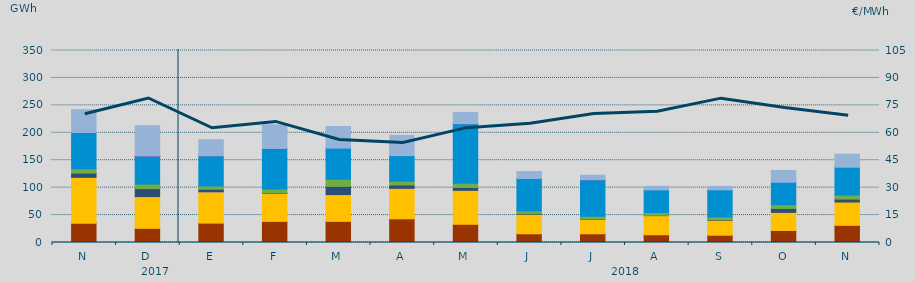
| Category | Carbón | Ciclo Combinado | Cogeneración | Consumo Bombeo | Eólica | Hidráulica | Nuclear | Otras Renovables | Turbinación bombeo |
|---|---|---|---|---|---|---|---|---|---|
| N | 35124.9 | 83653.4 | 0 | 7774.4 | 7943.5 | 66112.3 | 0 | 299.1 | 41077.1 |
| D | 25784.6 | 57877.3 | 0 | 14602.9 | 8236.4 | 50297.7 | 1085.4 | 57.5 | 54906.6 |
| E | 35353.2 | 57056.1 | 10.8 | 4781.6 | 5669.6 | 55012.6 | 282.3 | 69.8 | 28937.8 |
| F | 38501.6 | 51366.4 | 3 | 876.5 | 6719.4 | 74091.8 | 129.7 | 8.1 | 42931.7 |
| M | 38546.8 | 48796.7 | 0 | 14986.9 | 13034.1 | 57129.4 | 0 | 7.9 | 39005.1 |
| A | 43196.7 | 55522.2 | 0 | 6134.1 | 6758.4 | 46798.3 | 0 | 0 | 36861.2 |
| M | 33193.7 | 61920.1 | 0 | 5137.4 | 7808.1 | 108282.8 | 306.6 | 16.5 | 20554.6 |
| J | 15935.3 | 35519.8 | 0 | 1509.9 | 4554.3 | 58954.4 | 75 | 0 | 12771.1 |
| J | 15870.8 | 26056.8 | 0 | 559.4 | 5548.3 | 66078.1 | 193.3 | 0 | 8452.7 |
| A | 14111.4 | 34857 | 0 | 481.3 | 5182.6 | 41241.9 | 0 | 0 | 6495.2 |
| S | 13245.9 | 27321.2 | 0 | 906.1 | 5246.7 | 49548.9 | 0 | 4 | 6015.5 |
| O | 21827.2 | 33089.3 | 0 | 7219.1 | 6754.8 | 41404 | 0 | 2.5 | 21004.3 |
| N | 31318.1 | 42466.7 | 0 | 5322 | 7477 | 50882.1 | 34.4 | 69.8 | 23397.6 |